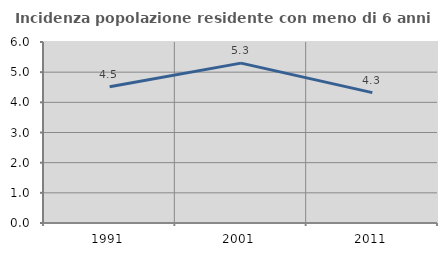
| Category | Incidenza popolazione residente con meno di 6 anni |
|---|---|
| 1991.0 | 4.517 |
| 2001.0 | 5.3 |
| 2011.0 | 4.322 |